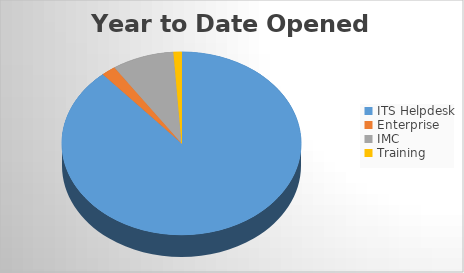
| Category | YTD Opened Tickets | 6M Opened |
|---|---|---|
| ITS Helpdesk | 2030 | 2030 |
| Enterprise | 45 | 45 |
| IMC | 192 | 192 |
| Training | 25 | 25 |